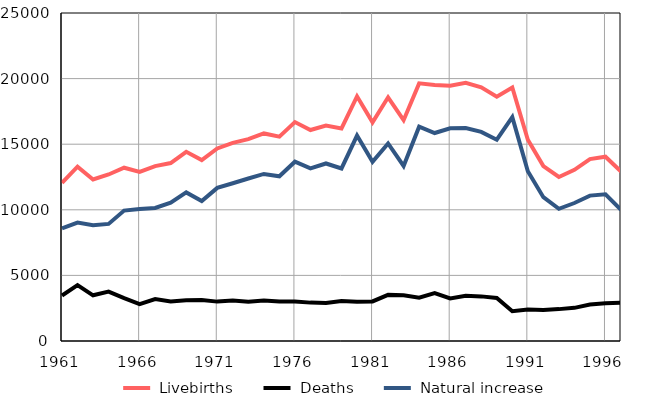
| Category |  Livebirths |  Deaths |  Natural increase |
|---|---|---|---|
| 1961.0 | 12053 | 3462 | 8591 |
| 1962.0 | 13289 | 4264 | 9025 |
| 1963.0 | 12308 | 3482 | 8826 |
| 1964.0 | 12691 | 3766 | 8925 |
| 1965.0 | 13206 | 3265 | 9941 |
| 1966.0 | 12882 | 2813 | 10069 |
| 1967.0 | 13334 | 3191 | 10143 |
| 1968.0 | 13561 | 3016 | 10545 |
| 1969.0 | 14420 | 3097 | 11323 |
| 1970.0 | 13794 | 3131 | 10663 |
| 1971.0 | 14673 | 3002 | 11671 |
| 1972.0 | 15104 | 3080 | 12024 |
| 1973.0 | 15384 | 3000 | 12384 |
| 1974.0 | 15821 | 3087 | 12734 |
| 1975.0 | 15574 | 3020 | 12554 |
| 1976.0 | 16686 | 3018 | 13668 |
| 1977.0 | 16079 | 2925 | 13154 |
| 1978.0 | 16425 | 2894 | 13531 |
| 1979.0 | 16205 | 3054 | 13151 |
| 1980.0 | 18648 | 2991 | 15657 |
| 1981.0 | 16670 | 3018 | 13652 |
| 1982.0 | 18574 | 3515 | 15059 |
| 1983.0 | 16830 | 3485 | 13345 |
| 1984.0 | 19637 | 3303 | 16334 |
| 1985.0 | 19507 | 3655 | 15852 |
| 1986.0 | 19450 | 3243 | 16207 |
| 1987.0 | 19680 | 3441 | 16239 |
| 1988.0 | 19342 | 3401 | 15941 |
| 1989.0 | 18623 | 3284 | 15339 |
| 1990.0 | 19325 | 2265 | 17060 |
| 1991.0 | 15342 | 2408 | 12934 |
| 1992.0 | 13330 | 2371 | 10959 |
| 1993.0 | 12503 | 2430 | 10073 |
| 1994.0 | 13044 | 2527 | 10517 |
| 1995.0 | 13866 | 2786 | 11080 |
| 1996.0 | 14049 | 2872 | 11177 |
| 1997.0 | 12923 | 2921 | 10002 |